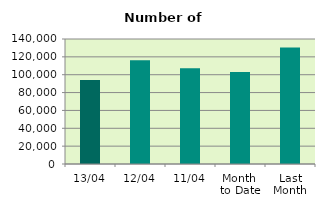
| Category | Series 0 |
|---|---|
| 13/04 | 94118 |
| 12/04 | 116166 |
| 11/04 | 107364 |
| Month 
to Date | 103006 |
| Last
Month | 130565.565 |